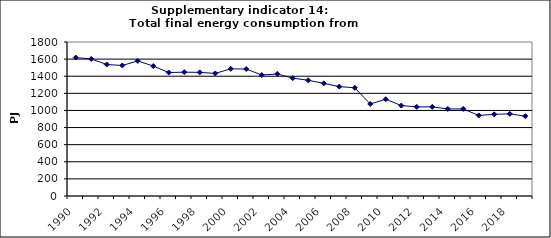
| Category | Total final energy consumption from industry, PJ |
|---|---|
| 1990 | 1618.6 |
| 1991 | 1601.732 |
| 1992 | 1536.999 |
| 1993 | 1525.662 |
| 1994 | 1578.897 |
| 1995 | 1518.823 |
| 1996 | 1443.198 |
| 1997 | 1447.69 |
| 1998 | 1444.955 |
| 1999 | 1432.801 |
| 2000 | 1486.572 |
| 2001 | 1483.912 |
| 2002 | 1413.626 |
| 2003 | 1426.618 |
| 2004 | 1377.978 |
| 2005 | 1352.47 |
| 2006 | 1316.422 |
| 2007 | 1278.661 |
| 2008 | 1265.234 |
| 2009 | 1075.475 |
| 2010 | 1130.888 |
| 2011 | 1057.346 |
| 2012 | 1041.494 |
| 2013 | 1042.066 |
| 2014 | 1017.474 |
| 2015 | 1017.619 |
| 2016 | 941.332 |
| 2017 | 954.926 |
| 2018 | 960.16 |
| 2019 | 933.576 |